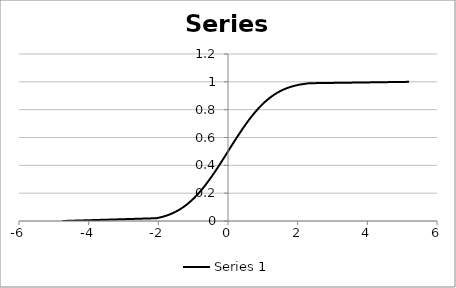
| Category | Series 1 |
|---|---|
| -4.753424308822899 | 0 |
| -2.0537489106318225 | 0.02 |
| -1.8807936081512509 | 0.03 |
| -1.7506860712521695 | 0.04 |
| -1.6448536269514726 | 0.05 |
| -1.554773594596853 | 0.06 |
| -1.4757910281791702 | 0.07 |
| -1.4050715603096353 | 0.08 |
| -1.340755033690216 | 0.09 |
| -1.2815515655446006 | 0.1 |
| -1.2265281200366105 | 0.11 |
| -1.1749867920660904 | 0.12 |
| -1.1263911290388013 | 0.13 |
| -1.0803193408149565 | 0.14 |
| -1.0364333894937898 | 0.15 |
| -0.9944578832097497 | 0.16 |
| -0.9541652531461955 | 0.17 |
| -0.915365087842815 | 0.18 |
| -0.8778962950512285 | 0.19 |
| -0.8416212335729145 | 0.2 |
| -0.8064212470182406 | 0.21 |
| -0.772193214188685 | 0.22 |
| -0.7388468491852139 | 0.23 |
| -0.7063025628400873 | 0.24 |
| -0.6744897501960819 | 0.25 |
| -0.643345405392917 | 0.26 |
| -0.6128129910166273 | 0.27 |
| -0.5828415072712163 | 0.28 |
| -0.553384719555673 | 0.29 |
| -0.5244005127080409 | 0.3 |
| -0.49585034734745354 | 0.31 |
| -0.4676987991145083 | 0.32 |
| -0.43991316567323374 | 0.33 |
| -0.41246312944140484 | 0.34 |
| -0.38532046640756784 | 0.35 |
| -0.35845879325119384 | 0.36 |
| -0.3318533464368166 | 0.37 |
| -0.30548078809939727 | 0.38 |
| -0.27931903444745415 | 0.39 |
| -0.2533471031357998 | 0.4 |
| -0.2275449766411495 | 0.41 |
| -0.20189347914185088 | 0.42 |
| -0.17637416478086138 | 0.43 |
| -0.15096921549677725 | 0.44 |
| -0.12566134685507402 | 0.45 |
| -0.10043372051146976 | 0.46 |
| -0.0752698620998299 | 0.47 |
| -0.050153583464733656 | 0.48 |
| -0.02506890825871106 | 0.49 |
| 0.0 | 0.5 |
| 0.02506890825871106 | 0.51 |
| 0.050153583464733656 | 0.52 |
| 0.0752698620998299 | 0.53 |
| 0.10043372051146988 | 0.54 |
| 0.12566134685507416 | 0.55 |
| 0.15096921549677741 | 0.56 |
| 0.1763741647808612 | 0.57 |
| 0.20189347914185077 | 0.58 |
| 0.22754497664114934 | 0.59 |
| 0.2533471031357998 | 0.6 |
| 0.27931903444745415 | 0.61 |
| 0.30548078809939727 | 0.62 |
| 0.3318533464368166 | 0.63 |
| 0.35845879325119384 | 0.64 |
| 0.38532046640756784 | 0.65 |
| 0.41246312944140473 | 0.66 |
| 0.43991316567323396 | 0.67 |
| 0.46769879911450835 | 0.68 |
| 0.4958503473474533 | 0.69 |
| 0.5244005127080408 | 0.7 |
| 0.5533847195556727 | 0.71 |
| 0.5828415072712163 | 0.72 |
| 0.6128129910166273 | 0.73 |
| 0.643345405392917 | 0.74 |
| 0.6744897501960819 | 0.75 |
| 0.7063025628400873 | 0.76 |
| 0.7388468491852139 | 0.77 |
| 0.772193214188685 | 0.78 |
| 0.8064212470182406 | 0.79 |
| 0.8416212335729147 | 0.8 |
| 0.8778962950512286 | 0.81 |
| 0.9153650878428126 | 0.82 |
| 0.9541652531461955 | 0.83 |
| 0.9944578832097497 | 0.84 |
| 1.0364333894937898 | 0.85 |
| 1.0803193408149565 | 0.86 |
| 1.1263911290388013 | 0.87 |
| 1.1749867920660904 | 0.88 |
| 1.2265281200366105 | 0.89 |
| 1.2815515655446006 | 0.9 |
| 1.340755033690216 | 0.91 |
| 1.4050715603096329 | 0.92 |
| 1.4757910281791713 | 0.93 |
| 1.5547735945968528 | 0.94 |
| 1.6448536269514715 | 0.95 |
| 1.7506860712521695 | 0.96 |
| 1.8807936081512504 | 0.97 |
| 2.053748910631822 | 0.98 |
| 2.3263478740408408 | 0.99 |
| 5.199337582290662 | 1 |